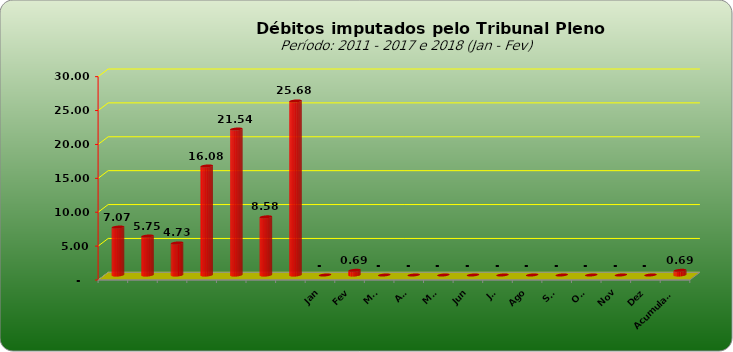
| Category |  7.073.154,74  |
|---|---|
|  | 7073154.74 |
|  | 5749129.25 |
|  | 4727033.51 |
|  | 16081820.48 |
|  | 21535723.6 |
|  | 8578266.09 |
|  | 25676499.17 |
| Jan | 0 |
| Fev | 689867.86 |
| Mar | 0 |
| Abr | 0 |
| Mai | 0 |
| Jun | 0 |
| Jul | 0 |
| Ago | 0 |
| Set | 0 |
| Out | 0 |
| Nov | 0 |
| Dez | 0 |
| Acumulado | 689867.86 |